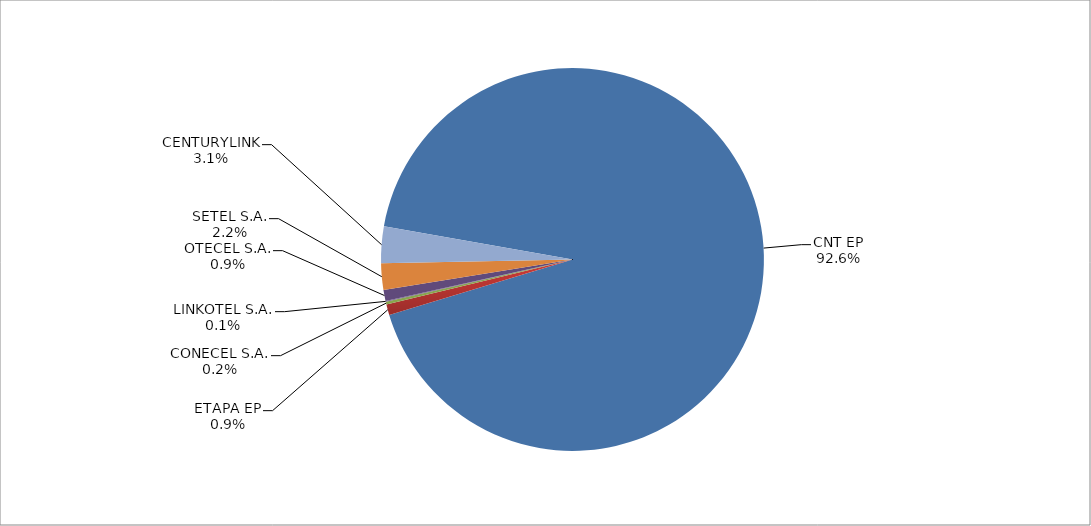
| Category | Series 0 |
|---|---|
| CNT EP | 2694 |
| ETAPA EP | 26 |
| CONECEL S.A. | 7 |
| LINKOTEL S.A. | 2 |
| OTECEL S.A. | 27 |
| SETEL S.A. | 65 |
| CENTURYLINK | 90 |